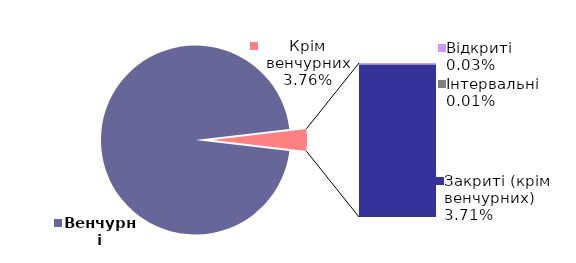
| Category | 30.06.2023 |
|---|---|
| Венчурні | 0.962 |
| Відкриті | 0 |
| Інтервальні | 0 |
| Закриті (крім венчурних) | 0.037 |